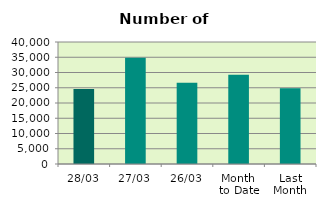
| Category | Series 0 |
|---|---|
| 28/03 | 24620 |
| 27/03 | 34842 |
| 26/03 | 26638 |
| Month 
to Date | 29277.2 |
| Last
Month | 24872.2 |